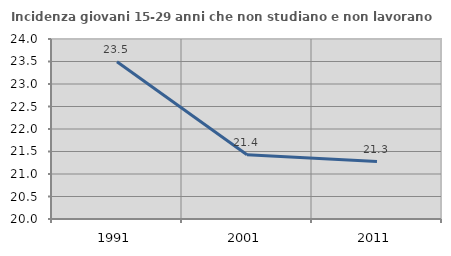
| Category | Incidenza giovani 15-29 anni che non studiano e non lavorano  |
|---|---|
| 1991.0 | 23.496 |
| 2001.0 | 21.429 |
| 2011.0 | 21.277 |